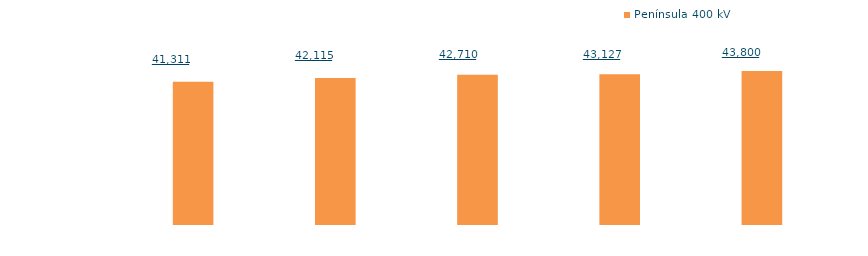
| Category | Península 400 kV |
|---|---|
| 2012.0 | 20108.846 |
| 2013.0 | 20639.478 |
| 2014.0 | 21093.512 |
| 2015.0 | 21183.826 |
| 2016.0 | 21619.966 |